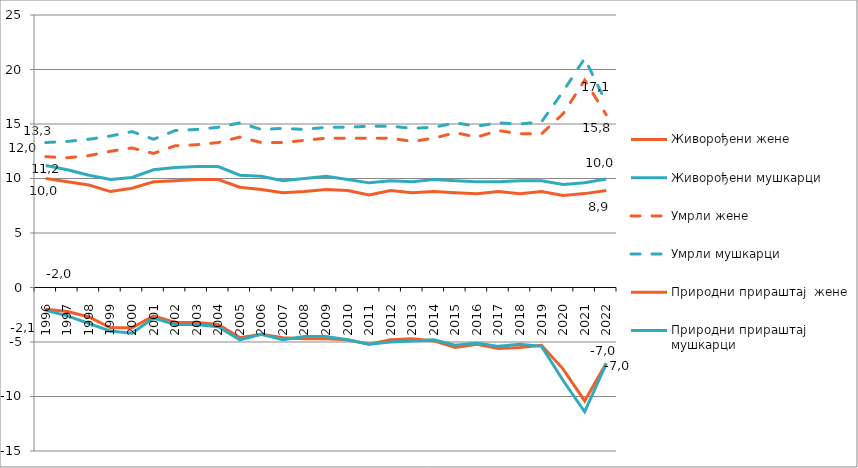
| Category | Живорођени | Умрли | Природни прираштај  |
|---|---|---|---|
| 1996.0 | 11.2 | 13.3 | -2.1 |
| 1997.0 | 10.8 | 13.4 | -2.6 |
| 1998.0 | 10.3 | 13.6 | -3.3 |
| 1999.0 | 9.9 | 13.9 | -4 |
| 2000.0 | 10.1 | 14.3 | -4.2 |
| 2001.0 | 10.8 | 13.6 | -2.8 |
| 2002.0 | 11 | 14.4 | -3.4 |
| 2003.0 | 11.1 | 14.5 | -3.4 |
| 2004.0 | 11.1 | 14.7 | -3.6 |
| 2005.0 | 10.3 | 15.1 | -4.8 |
| 2006.0 | 10.2 | 14.5 | -4.3 |
| 2007.0 | 9.8 | 14.6 | -4.8 |
| 2008.0 | 10 | 14.5 | -4.5 |
| 2009.0 | 10.2 | 14.7 | -4.5 |
| 2010.0 | 9.9 | 14.7 | -4.8 |
| 2011.0 | 9.6 | 14.8 | -5.2 |
| 2012.0 | 9.8 | 14.8 | -5 |
| 2013.0 | 9.7 | 14.6 | -4.9 |
| 2014.0 | 9.9 | 14.7 | -4.8 |
| 2015.0 | 9.8 | 15.1 | -5.3 |
| 2016.0 | 9.7 | 14.8 | -5.1 |
| 2017.0 | 9.7 | 15.1 | -5.4 |
| 2018.0 | 9.8 | 15 | -5.2 |
| 2019.0 | 9.8 | 15.2 | -5.4 |
| 2020.0 | 9.458 | 17.989 | -8.531 |
| 2021.0 | 9.61 | 21.012 | -11.403 |
| 2022.0 | 9.956 | 16.955 | -6.999 |